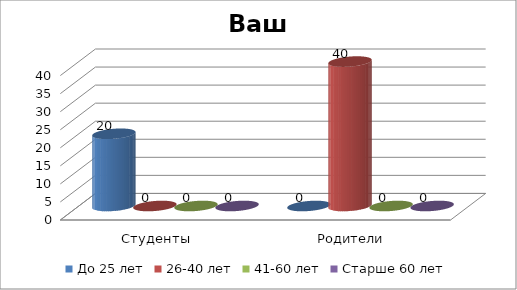
| Category | До 25 лет | 26-40 лет | 41-60 лет | Старше 60 лет |
|---|---|---|---|---|
| Студенты | 20 | 0 | 0 | 0 |
| Родители | 0 | 40 | 0 | 0 |